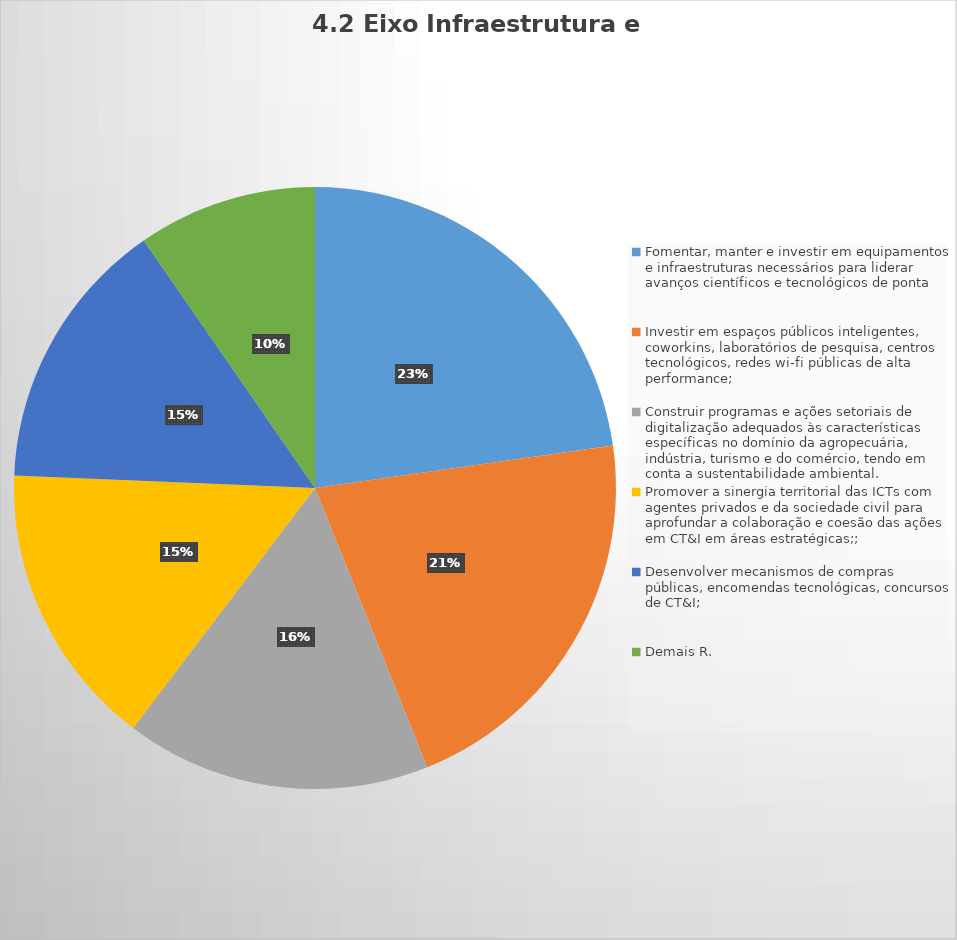
| Category | Series 0 |
|---|---|
| Fomentar, manter e investir em equipamentos e infraestruturas necessários para liderar avanços científicos e tecnológicos de ponta | 215 |
| Investir em espaços públicos inteligentes, coworkins, laboratórios de pesquisa, centros tecnológicos, redes wi-fi públicas de alta performance; | 200 |
| Construir programas e ações setoriais de digitalização adequados às características específicas no domínio da agropecuária, indústria, turismo e do comércio, tendo em conta a sustentabilidade ambiental. | 155 |
| Promover a sinergia territorial das ICTs com agentes privados e da sociedade civil para aprofundar a colaboração e coesão das ações em CT&I em áreas estratégicas;; | 145 |
| Desenvolver mecanismos de compras públicas, encomendas tecnológicas, concursos de CT&I; | 139 |
| Demais R. | 91 |